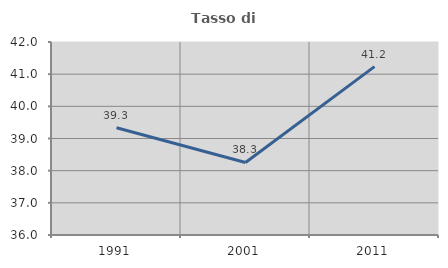
| Category | Tasso di occupazione   |
|---|---|
| 1991.0 | 39.336 |
| 2001.0 | 38.254 |
| 2011.0 | 41.234 |